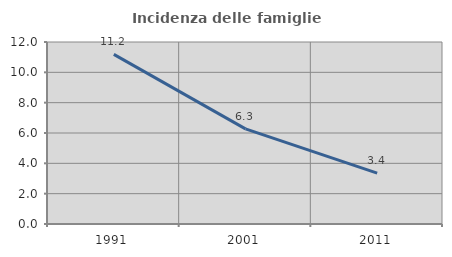
| Category | Incidenza delle famiglie numerose |
|---|---|
| 1991.0 | 11.188 |
| 2001.0 | 6.271 |
| 2011.0 | 3.356 |